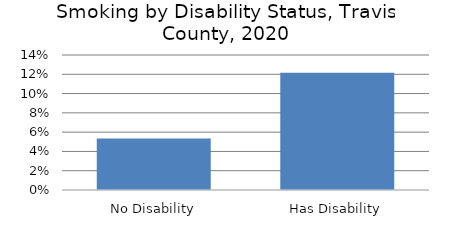
| Category | Series 0 |
|---|---|
| No Disability | 0.053 |
| Has Disability | 0.122 |